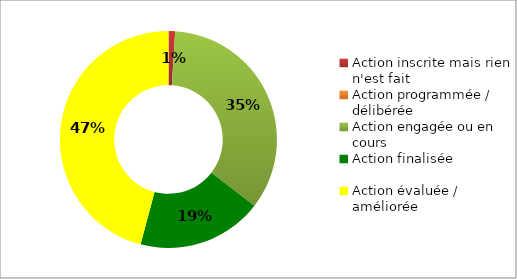
| Category | Series 0 |
|---|---|
| Action inscrite mais rien n'est fait | 0.01 |
| Action programmée / délibérée | 0 |
| Action engagée ou en cours | 0.35 |
| Action finalisée | 0.19 |
| Action évaluée / améliorée | 0.466 |